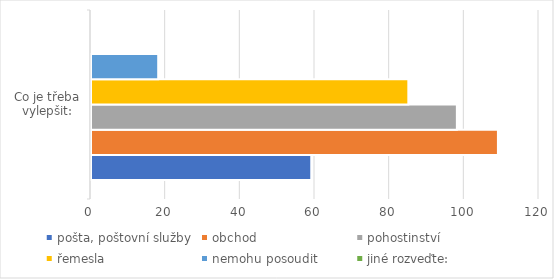
| Category | pošta, poštovní služby | obchod | pohostinství | řemesla | nemohu posoudit | jiné rozveďte:  |
|---|---|---|---|---|---|---|
| 0 | 59 | 109 | 98 | 85 | 18 | 0 |